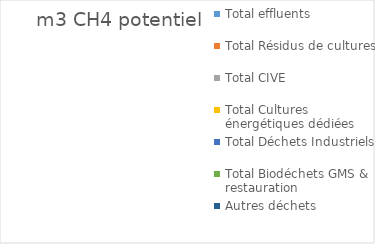
| Category | % CH4 du total |
|---|---|
| Total effluents | 0 |
| Total Résidus de cultures | 0 |
| Total CIVE | 0 |
| Total Cultures énergétiques dédiées | 0 |
| Total Déchets Industriels | 0 |
| Total Biodéchets GMS & restauration | 0 |
| Autres déchets | 0 |